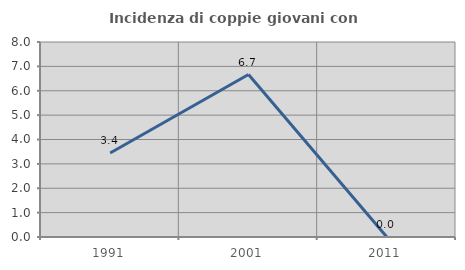
| Category | Incidenza di coppie giovani con figli |
|---|---|
| 1991.0 | 3.448 |
| 2001.0 | 6.667 |
| 2011.0 | 0 |